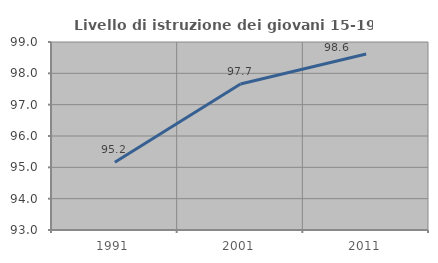
| Category | Livello di istruzione dei giovani 15-19 anni |
|---|---|
| 1991.0 | 95.159 |
| 2001.0 | 97.659 |
| 2011.0 | 98.615 |